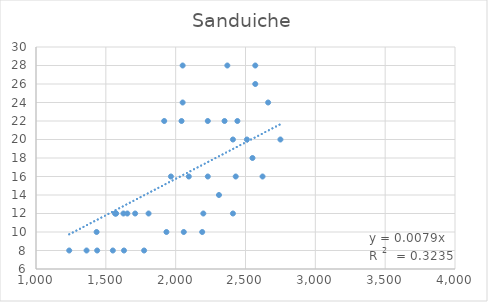
| Category | Sanduiche |
|---|---|
| 1550.0 | 8 |
| 2310.0 | 14 |
| 1570.0 | 12 |
| 2042.0 | 22 |
| 1934.0 | 10 |
| 1630.0 | 8 |
| 1574.0 | 12 |
| 1566.0 | 12 |
| 2050.0 | 24 |
| 2350.0 | 22 |
| 1918.0 | 22 |
| 1438.0 | 8 |
| 1654.0 | 12 |
| 2058.0 | 10 |
| 2442.0 | 22 |
| 2050.0 | 28 |
| 1966.0 | 16 |
| 2550.0 | 18 |
| 2198.0 | 12 |
| 1626.0 | 12 |
| 2510.0 | 20 |
| 2410.0 | 20 |
| 2622.0 | 16 |
| 1362.0 | 8 |
| 2750.0 | 20 |
| 1806.0 | 12 |
| 2190.0 | 10 |
| 2430.0 | 16 |
| 2094.0 | 16 |
| 2570.0 | 28 |
| 2410.0 | 12 |
| 1774.0 | 8 |
| 1710.0 | 12 |
| 2370.0 | 28 |
| 2230.0 | 22 |
| 2570.0 | 26 |
| 2662.0 | 24 |
| 1238.0 | 8 |
| 2230.0 | 16 |
| 1434.0 | 10 |